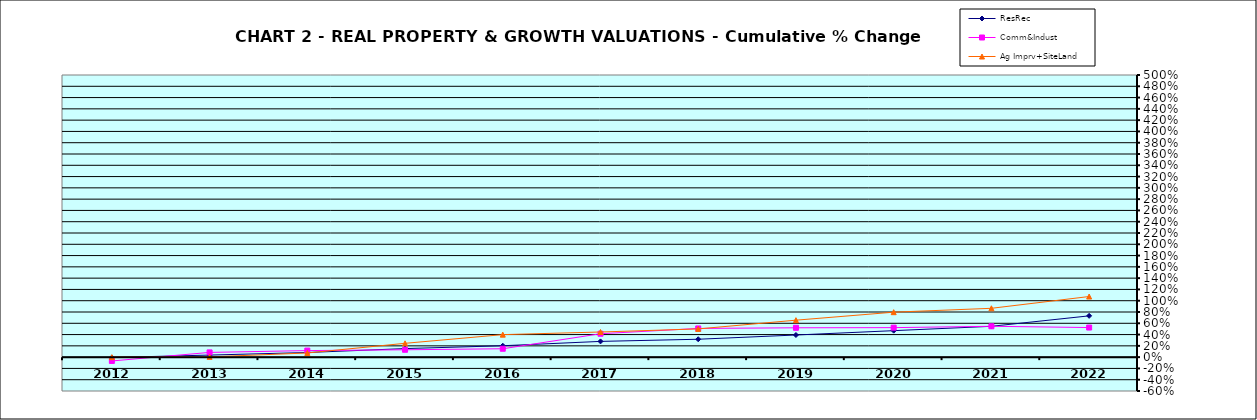
| Category | ResRec | Comm&Indust | Ag Imprv+SiteLand |
|---|---|---|---|
| 2012.0 | -0.006 | -0.068 | 0 |
| 2013.0 | 0.036 | 0.084 | 0.005 |
| 2014.0 | 0.082 | 0.116 | 0.074 |
| 2015.0 | 0.152 | 0.13 | 0.245 |
| 2016.0 | 0.202 | 0.149 | 0.399 |
| 2017.0 | 0.279 | 0.415 | 0.445 |
| 2018.0 | 0.317 | 0.509 | 0.5 |
| 2019.0 | 0.392 | 0.52 | 0.655 |
| 2020.0 | 0.469 | 0.523 | 0.797 |
| 2021.0 | 0.546 | 0.547 | 0.865 |
| 2022.0 | 0.732 | 0.525 | 1.074 |